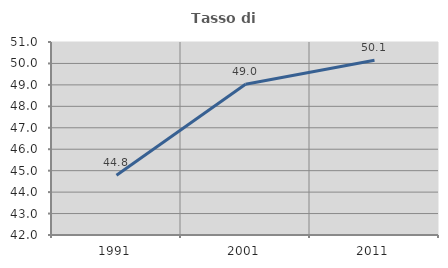
| Category | Tasso di occupazione   |
|---|---|
| 1991.0 | 44.783 |
| 2001.0 | 49.029 |
| 2011.0 | 50.145 |